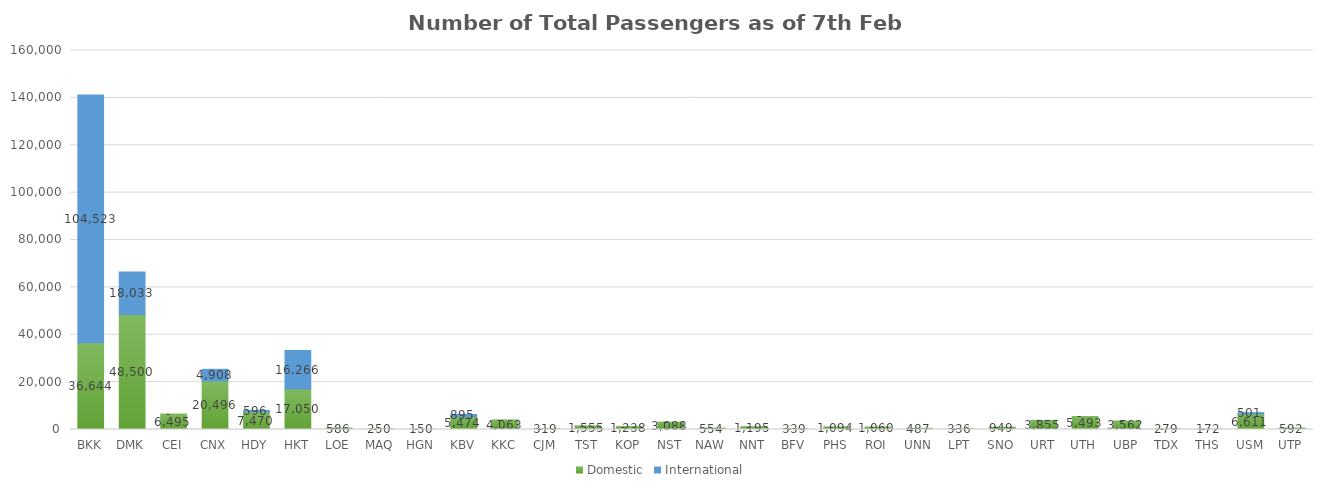
| Category | Domestic | International |
|---|---|---|
| BKK | 36644 | 104523 |
| DMK | 48500 | 18033 |
| CEI | 6495 | 0 |
| CNX | 20496 | 4908 |
| HDY | 7470 | 596 |
| HKT | 17050 | 16266 |
| LOE | 586 | 0 |
| MAQ | 250 | 0 |
| HGN | 150 | 0 |
| KBV | 5474 | 895 |
| KKC | 4063 | 0 |
| CJM | 319 | 0 |
| TST | 1555 | 0 |
| KOP | 1238 | 0 |
| NST | 3088 | 0 |
| NAW | 554 | 0 |
| NNT | 1195 | 0 |
| BFV | 339 | 0 |
| PHS | 1094 | 0 |
| ROI | 1060 | 0 |
| UNN | 487 | 0 |
| LPT | 336 | 0 |
| SNO | 949 | 0 |
| URT | 3855 | 0 |
| UTH | 5493 | 0 |
| UBP | 3562 | 0 |
| TDX | 279 | 0 |
| THS | 172 | 0 |
| USM | 6611 | 501 |
| UTP | 592 | 0 |